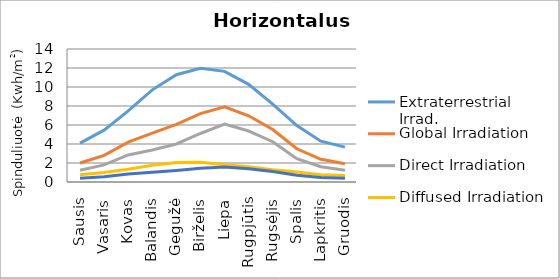
| Category | Extraterrestrial Irrad. | Global Irradiation | Direct Irradiation | Diffused Irradiation | Reflected Irradiation |
|---|---|---|---|---|---|
| Sausis | 4.099 | 2 | 1.242 | 0.758 | 0.4 |
| Vasaris | 5.457 | 2.806 | 1.804 | 1.002 | 0.561 |
| Kovas | 7.483 | 4.194 | 2.849 | 1.346 | 0.839 |
| Balandis | 9.7 | 5.139 | 3.368 | 1.771 | 1.028 |
| Gegužė | 11.288 | 6.056 | 4 | 2.055 | 1.211 |
| Birželis | 11.966 | 7.194 | 5.107 | 2.087 | 1.439 |
| Liepa | 11.647 | 7.917 | 6.104 | 1.813 | 1.583 |
| Rugpjūtis | 10.284 | 6.972 | 5.366 | 1.607 | 1.394 |
| Rugsėjis | 8.19 | 5.528 | 4.24 | 1.288 | 1.106 |
| Spalis | 5.94 | 3.5 | 2.453 | 1.047 | 0.7 |
| Lapkritis | 4.3 | 2.389 | 1.613 | 0.776 | 0.478 |
| Gruodis | 3.675 | 1.917 | 1.244 | 0.673 | 0.383 |